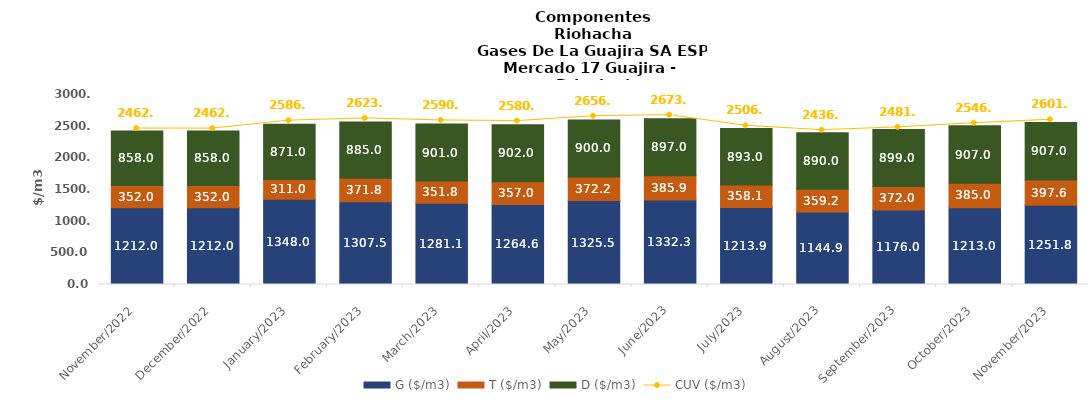
| Category | G ($/m3) | T ($/m3) | D ($/m3) |
|---|---|---|---|
| 2022-11-01 | 1212 | 352 | 858 |
| 2022-12-01 | 1212 | 352 | 858 |
| 2023-01-01 | 1348 | 310.95 | 871 |
| 2023-02-01 | 1307.53 | 371.84 | 885 |
| 2023-03-01 | 1281.1 | 351.77 | 901 |
| 2023-04-01 | 1264.63 | 356.99 | 902 |
| 2023-05-01 | 1325.54 | 372.19 | 900 |
| 2023-06-01 | 1332.29 | 385.86 | 897 |
| 2023-07-01 | 1213.88 | 358.06 | 893 |
| 2023-08-01 | 1144.92 | 359.17 | 890 |
| 2023-09-01 | 1176 | 372 | 899 |
| 2023-10-01 | 1213 | 385 | 907 |
| 2023-11-01 | 1251.77 | 397.64 | 907 |